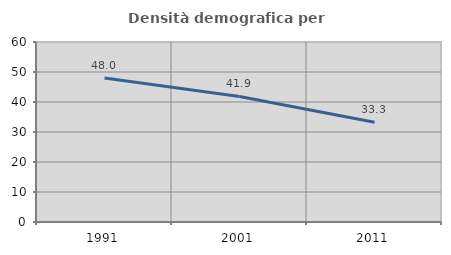
| Category | Densità demografica |
|---|---|
| 1991.0 | 47.99 |
| 2001.0 | 41.865 |
| 2011.0 | 33.263 |